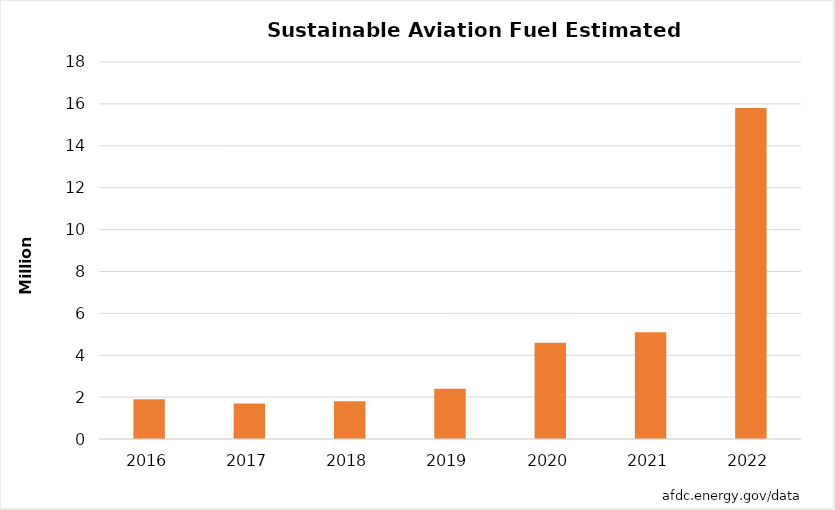
| Category | Series 1 |
|---|---|
| 2016.0 | 1.9 |
| 2017.0 | 1.7 |
| 2018.0 | 1.8 |
| 2019.0 | 2.4 |
| 2020.0 | 4.6 |
| 2021.0 | 5.1 |
| 2022.0 | 15.8 |